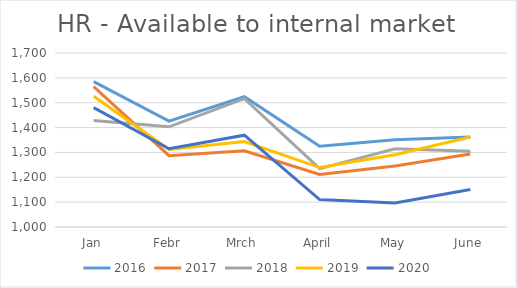
| Category | 2016 | 2017 | 2018 | 2019 | 2020 |
|---|---|---|---|---|---|
| Jan | 1585 | 1564.787 | 1428.198 | 1525.749 | 1480.456 |
| Febr | 1426 | 1286.883 | 1402.999 | 1312.198 | 1314.737 |
| Mrch | 1524 | 1306.641 | 1516.406 | 1343.604 | 1369.51 |
| April | 1325 | 1211.586 | 1234.845 | 1239.179 | 1110.529 |
| May | 1351 | 1245.244 | 1314.899 | 1290.4 | 1096.875 |
| June | 1362 | 1293.801 | 1304.858 | 1362.061 | 1151.02 |